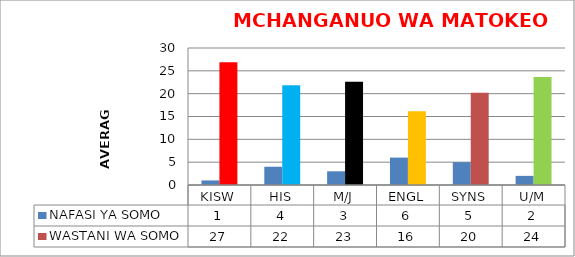
| Category | NAFASI YA SOMO | WASTANI WA SOMO |
|---|---|---|
| KISW | 1 | 26.901 |
| HIS | 4 | 21.862 |
| M/J | 3 | 22.63 |
| ENGL | 6 | 16.168 |
| SYNS | 5 | 20.193 |
| U/M | 2 | 23.665 |